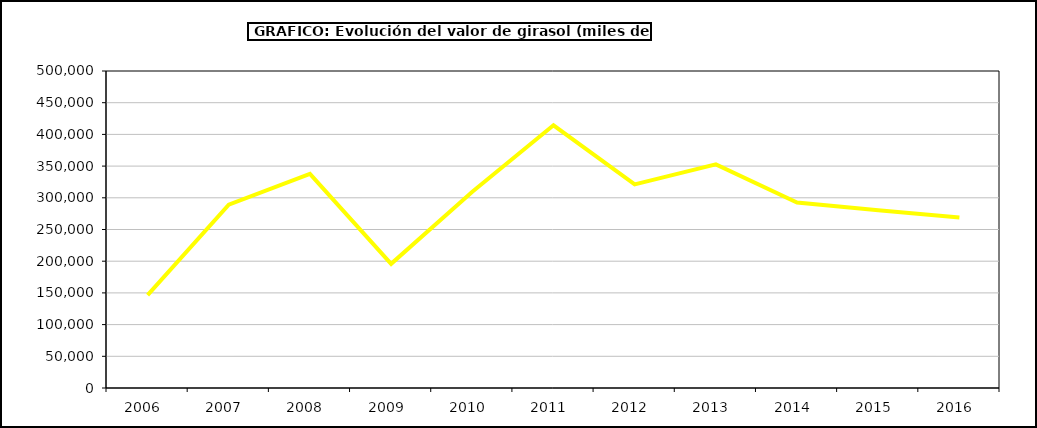
| Category | Valor |
|---|---|
| 2006.0 | 146386.551 |
| 2007.0 | 289082.622 |
| 2008.0 | 337817.138 |
| 2009.0 | 195820.408 |
| 2010.0 | 309453.606 |
| 2011.0 | 414373.997 |
| 2012.0 | 321265.307 |
| 2013.0 | 352632.719 |
| 2014.0 | 292566.702 |
| 2015.0 | 280295 |
| 2016.0 | 268873 |